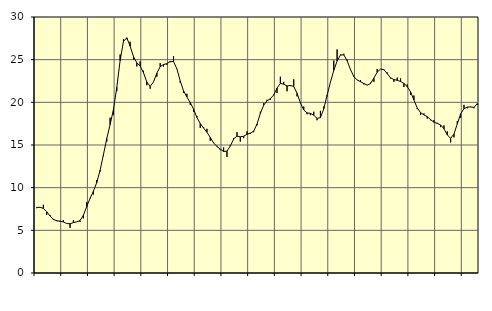
| Category | Piggar | Series 1 |
|---|---|---|
| nan | 7.6 | 7.68 |
| 87.0 | 7.7 | 7.7 |
| 87.0 | 8 | 7.57 |
| 87.0 | 6.8 | 7.19 |
| nan | 6.8 | 6.68 |
| 88.0 | 6.2 | 6.3 |
| 88.0 | 6.2 | 6.11 |
| 88.0 | 6 | 6.08 |
| nan | 6.2 | 5.98 |
| 89.0 | 5.8 | 5.8 |
| 89.0 | 5.3 | 5.77 |
| 89.0 | 6.2 | 5.91 |
| nan | 6 | 6 |
| 90.0 | 6 | 6.15 |
| 90.0 | 6.4 | 6.77 |
| 90.0 | 8.3 | 7.79 |
| nan | 8.8 | 8.75 |
| 91.0 | 9.2 | 9.59 |
| 91.0 | 10.9 | 10.6 |
| 91.0 | 11.9 | 12.04 |
| nan | 13.7 | 13.86 |
| 92.0 | 15.4 | 15.76 |
| 92.0 | 18.2 | 17.4 |
| 92.0 | 18.5 | 19.14 |
| nan | 21.3 | 21.76 |
| 93.0 | 25.6 | 24.9 |
| 93.0 | 27.4 | 27.14 |
| 93.0 | 27.4 | 27.56 |
| nan | 27.1 | 26.58 |
| 94.0 | 25 | 25.37 |
| 94.0 | 24.2 | 24.63 |
| 94.0 | 24.8 | 24.25 |
| nan | 23.7 | 23.47 |
| 95.0 | 22 | 22.38 |
| 95.0 | 21.6 | 21.87 |
| 95.0 | 22.4 | 22.39 |
| nan | 23 | 23.42 |
| 96.0 | 24.6 | 24.18 |
| 96.0 | 24.2 | 24.43 |
| 96.0 | 24.4 | 24.53 |
| nan | 24.7 | 24.78 |
| 97.0 | 25.4 | 24.78 |
| 97.0 | 23.9 | 23.93 |
| 97.0 | 22.3 | 22.51 |
| nan | 21.1 | 21.34 |
| 98.0 | 21 | 20.62 |
| 98.0 | 19.7 | 19.98 |
| 98.0 | 18.9 | 19.19 |
| nan | 18.4 | 18.23 |
| 99.0 | 17 | 17.52 |
| 99.0 | 17.1 | 16.99 |
| 99.0 | 16.9 | 16.49 |
| nan | 15.5 | 15.89 |
| 0.0 | 15.3 | 15.24 |
| 0.0 | 14.9 | 14.83 |
| 0.0 | 14.4 | 14.52 |
| nan | 14.7 | 14.24 |
| 1.0 | 13.6 | 14.28 |
| 1.0 | 15 | 14.87 |
| 1.0 | 15.8 | 15.7 |
| nan | 16.5 | 16.04 |
| 2.0 | 15.4 | 15.96 |
| 2.0 | 15.8 | 16.03 |
| 2.0 | 16.6 | 16.25 |
| nan | 16.3 | 16.39 |
| 3.0 | 16.5 | 16.62 |
| 3.0 | 17.3 | 17.45 |
| 3.0 | 18.9 | 18.7 |
| nan | 19.9 | 19.67 |
| 4.0 | 20.3 | 20.17 |
| 4.0 | 20.3 | 20.43 |
| 4.0 | 20.9 | 20.86 |
| nan | 21.1 | 21.67 |
| 5.0 | 23 | 22.22 |
| 5.0 | 22.4 | 22.12 |
| 5.0 | 21.3 | 21.92 |
| nan | 21.9 | 21.98 |
| 6.0 | 22.7 | 21.86 |
| 6.0 | 20.7 | 21.06 |
| 6.0 | 19.9 | 19.94 |
| nan | 19.5 | 19.1 |
| 7.0 | 18.6 | 18.76 |
| 7.0 | 18.5 | 18.71 |
| 7.0 | 18.9 | 18.49 |
| nan | 17.9 | 18.12 |
| 8.0 | 19 | 18.21 |
| 8.0 | 19.5 | 19.23 |
| 8.0 | 20.7 | 20.83 |
| nan | 22.4 | 22.37 |
| 9.0 | 24.9 | 23.75 |
| 9.0 | 26.2 | 24.84 |
| 9.0 | 25.6 | 25.54 |
| nan | 25.7 | 25.56 |
| 10.0 | 25 | 24.88 |
| 10.0 | 23.9 | 23.85 |
| 10.0 | 23.1 | 23.03 |
| nan | 22.6 | 22.62 |
| 11.0 | 22.6 | 22.42 |
| 11.0 | 22.1 | 22.21 |
| 11.0 | 22 | 22.02 |
| nan | 22.3 | 22.2 |
| 12.0 | 22.4 | 22.84 |
| 12.0 | 23.9 | 23.53 |
| 12.0 | 23.9 | 23.9 |
| nan | 23.9 | 23.83 |
| 13.0 | 23.5 | 23.37 |
| 13.0 | 22.8 | 22.88 |
| 13.0 | 22.4 | 22.67 |
| nan | 22.9 | 22.58 |
| 14.0 | 22.8 | 22.45 |
| 14.0 | 21.8 | 22.21 |
| 14.0 | 22.1 | 21.84 |
| nan | 20.9 | 21.23 |
| 15.0 | 20.8 | 20.27 |
| 15.0 | 19.2 | 19.35 |
| 15.0 | 18.5 | 18.79 |
| nan | 18.7 | 18.53 |
| 16.0 | 18.1 | 18.32 |
| 16.0 | 17.9 | 17.97 |
| 16.0 | 17.9 | 17.67 |
| nan | 17.6 | 17.53 |
| 17.0 | 17.1 | 17.35 |
| 17.0 | 17.3 | 16.9 |
| 17.0 | 16.6 | 16.19 |
| nan | 15.3 | 15.78 |
| 18.0 | 15.9 | 16.29 |
| 18.0 | 17.8 | 17.48 |
| 18.0 | 18.2 | 18.65 |
| nan | 19.7 | 19.25 |
| 19.0 | 19.3 | 19.44 |
| 19.0 | 19.5 | 19.46 |
| 19.0 | 19.3 | 19.41 |
| nan | 19.7 | 19.85 |